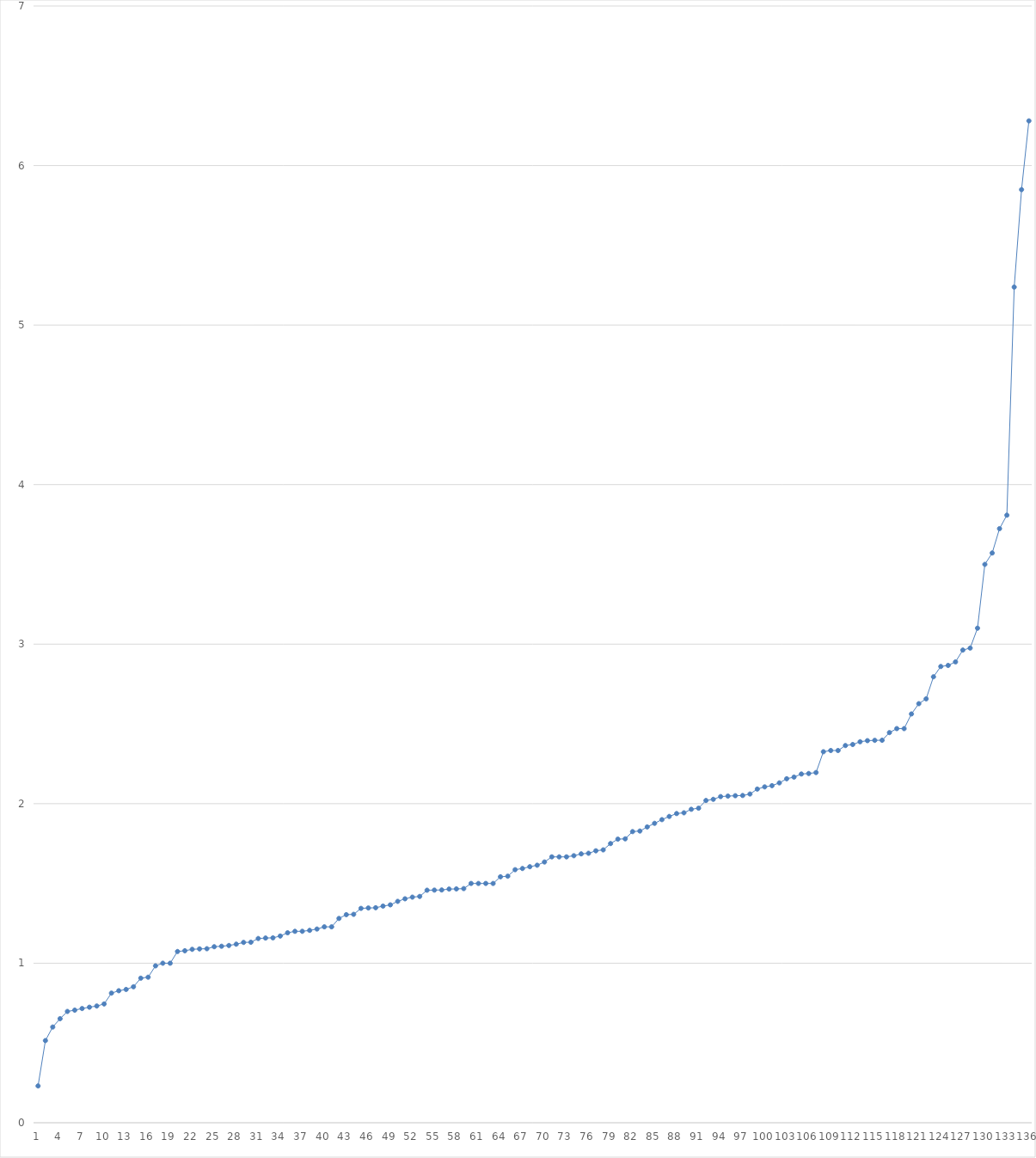
| Category | Series 0 |
|---|---|
| 0 | 0.231 |
| 1 | 0.515 |
| 2 | 0.6 |
| 3 | 0.652 |
| 4 | 0.698 |
| 5 | 0.706 |
| 6 | 0.716 |
| 7 | 0.724 |
| 8 | 0.732 |
| 9 | 0.745 |
| 10 | 0.812 |
| 11 | 0.828 |
| 12 | 0.836 |
| 13 | 0.852 |
| 14 | 0.906 |
| 15 | 0.912 |
| 16 | 0.983 |
| 17 | 1 |
| 18 | 1 |
| 19 | 1.074 |
| 20 | 1.078 |
| 21 | 1.087 |
| 22 | 1.09 |
| 23 | 1.091 |
| 24 | 1.103 |
| 25 | 1.106 |
| 26 | 1.111 |
| 27 | 1.119 |
| 28 | 1.13 |
| 29 | 1.132 |
| 30 | 1.155 |
| 31 | 1.158 |
| 32 | 1.159 |
| 33 | 1.17 |
| 34 | 1.191 |
| 35 | 1.2 |
| 36 | 1.2 |
| 37 | 1.206 |
| 38 | 1.214 |
| 39 | 1.228 |
| 40 | 1.228 |
| 41 | 1.281 |
| 42 | 1.304 |
| 43 | 1.306 |
| 44 | 1.344 |
| 45 | 1.346 |
| 46 | 1.348 |
| 47 | 1.358 |
| 48 | 1.366 |
| 49 | 1.388 |
| 50 | 1.404 |
| 51 | 1.414 |
| 52 | 1.419 |
| 53 | 1.458 |
| 54 | 1.458 |
| 55 | 1.459 |
| 56 | 1.465 |
| 57 | 1.466 |
| 58 | 1.468 |
| 59 | 1.5 |
| 60 | 1.5 |
| 61 | 1.5 |
| 62 | 1.5 |
| 63 | 1.542 |
| 64 | 1.545 |
| 65 | 1.586 |
| 66 | 1.594 |
| 67 | 1.605 |
| 68 | 1.614 |
| 69 | 1.634 |
| 70 | 1.667 |
| 71 | 1.667 |
| 72 | 1.667 |
| 73 | 1.674 |
| 74 | 1.685 |
| 75 | 1.689 |
| 76 | 1.705 |
| 77 | 1.711 |
| 78 | 1.75 |
| 79 | 1.778 |
| 80 | 1.78 |
| 81 | 1.825 |
| 82 | 1.829 |
| 83 | 1.854 |
| 84 | 1.877 |
| 85 | 1.9 |
| 86 | 1.92 |
| 87 | 1.938 |
| 88 | 1.943 |
| 89 | 1.965 |
| 90 | 1.972 |
| 91 | 2.02 |
| 92 | 2.027 |
| 93 | 2.044 |
| 94 | 2.048 |
| 95 | 2.05 |
| 96 | 2.051 |
| 97 | 2.061 |
| 98 | 2.092 |
| 99 | 2.105 |
| 100 | 2.113 |
| 101 | 2.13 |
| 102 | 2.156 |
| 103 | 2.167 |
| 104 | 2.186 |
| 105 | 2.189 |
| 106 | 2.195 |
| 107 | 2.326 |
| 108 | 2.333 |
| 109 | 2.333 |
| 110 | 2.364 |
| 111 | 2.371 |
| 112 | 2.388 |
| 113 | 2.395 |
| 114 | 2.397 |
| 115 | 2.398 |
| 116 | 2.445 |
| 117 | 2.471 |
| 118 | 2.471 |
| 119 | 2.562 |
| 120 | 2.627 |
| 121 | 2.657 |
| 122 | 2.795 |
| 123 | 2.86 |
| 124 | 2.867 |
| 125 | 2.889 |
| 126 | 2.963 |
| 127 | 2.976 |
| 128 | 3.1 |
| 129 | 3.5 |
| 130 | 3.571 |
| 131 | 3.724 |
| 132 | 3.809 |
| 133 | 5.238 |
| 134 | 5.849 |
| 135 | 6.28 |